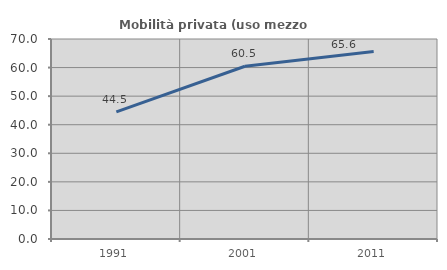
| Category | Mobilità privata (uso mezzo privato) |
|---|---|
| 1991.0 | 44.497 |
| 2001.0 | 60.469 |
| 2011.0 | 65.591 |